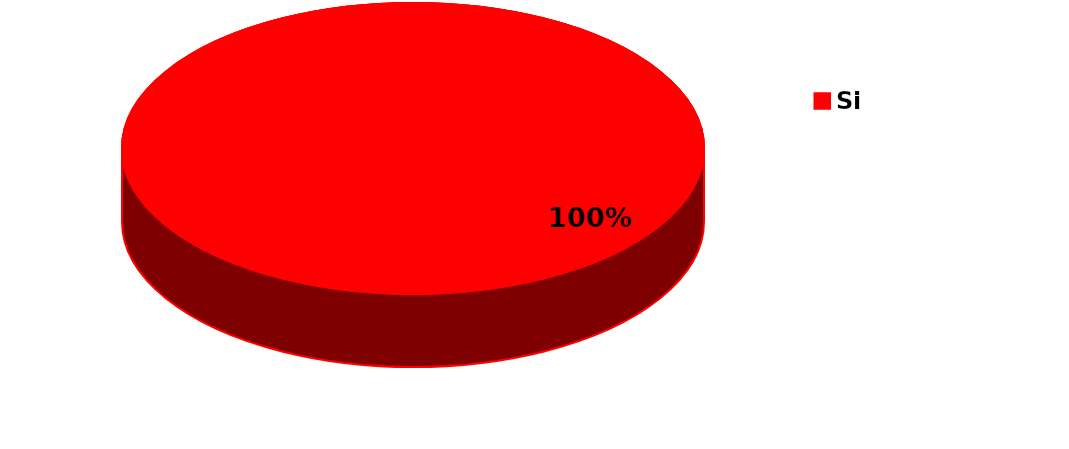
| Category | Series 0 |
|---|---|
| Si | 77 |